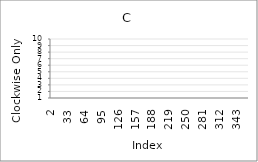
| Category | Series 0 |
|---|---|
| 2.0 | 7 |
| 3.0 | 3 |
| 4.0 | 10 |
| 5.0 | 10 |
| 6.0 | 8 |
| 7.0 | 3 |
| 8.0 | 6 |
| 9.0 | 9 |
| 10.0 | 2 |
| 11.0 | 2 |
| 12.0 | 7 |
| 13.0 | 8 |
| 14.0 | 4 |
| 15.0 | 7 |
| 16.0 | 5 |
| 17.0 | 4 |
| 18.0 | 9 |
| 19.0 | 4 |
| 20.0 | 10 |
| 21.0 | 6 |
| 22.0 | 9 |
| 23.0 | 3 |
| 24.0 | 3 |
| 25.0 | 8 |
| 26.0 | 1 |
| 27.0 | 3 |
| 28.0 | 6 |
| 29.0 | 6 |
| 30.0 | 5 |
| 31.0 | 99 |
| 32.0 | 99 |
| 33.0 | 99 |
| 34.0 | 99 |
| 35.0 | 99 |
| 36.0 | 99 |
| 37.0 | 99 |
| 38.0 | 99 |
| 39.0 | 99 |
| 40.0 | 99 |
| 41.0 | 99 |
| 42.0 | 99 |
| 43.0 | 99 |
| 44.0 | 99 |
| 45.0 | 99 |
| 46.0 | 99 |
| 47.0 | 99 |
| 48.0 | 99 |
| 49.0 | 99 |
| 50.0 | 99 |
| 51.0 | 99 |
| 52.0 | 99 |
| 53.0 | 99 |
| 54.0 | 99 |
| 55.0 | 99 |
| 56.0 | 99 |
| 57.0 | 99 |
| 58.0 | 99 |
| 59.0 | 99 |
| 60.0 | 99 |
| 61.0 | 99 |
| 62.0 | 99 |
| 63.0 | 99 |
| 64.0 | 99 |
| 65.0 | 99 |
| 66.0 | 99 |
| 67.0 | 99 |
| 68.0 | 99 |
| 69.0 | 99 |
| 70.0 | 99 |
| 71.0 | 99 |
| 72.0 | 99 |
| 73.0 | 99 |
| 74.0 | 99 |
| 75.0 | 99 |
| 76.0 | 99 |
| 77.0 | 99 |
| 78.0 | 99 |
| 79.0 | 99 |
| 80.0 | 99 |
| 81.0 | 99 |
| 82.0 | 99 |
| 83.0 | 99 |
| 84.0 | 99 |
| 85.0 | 99 |
| 86.0 | 99 |
| 87.0 | 99 |
| 88.0 | 99 |
| 89.0 | 99 |
| 90.0 | 99 |
| 91.0 | 99 |
| 92.0 | 99 |
| 93.0 | 99 |
| 94.0 | 99 |
| 95.0 | 99 |
| 96.0 | 99 |
| 97.0 | 99 |
| 98.0 | 99 |
| 99.0 | 99 |
| 100.0 | 99 |
| 101.0 | 99 |
| 102.0 | 99 |
| 103.0 | 99 |
| 104.0 | 99 |
| 105.0 | 99 |
| 106.0 | 99 |
| 107.0 | 99 |
| 108.0 | 99 |
| 109.0 | 99 |
| 110.0 | 99 |
| 111.0 | 99 |
| 112.0 | 99 |
| 113.0 | 99 |
| 114.0 | 99 |
| 115.0 | 99 |
| 116.0 | 99 |
| 117.0 | 99 |
| 118.0 | 99 |
| 119.0 | 99 |
| 120.0 | 99 |
| 121.0 | 99 |
| 122.0 | 99 |
| 123.0 | 99 |
| 124.0 | 99 |
| 125.0 | 99 |
| 126.0 | 99 |
| 127.0 | 99 |
| 128.0 | 99 |
| 129.0 | 99 |
| 130.0 | 99 |
| 131.0 | 99 |
| 132.0 | 99 |
| 133.0 | 99 |
| 134.0 | 99 |
| 135.0 | 99 |
| 136.0 | 99 |
| 137.0 | 99 |
| 138.0 | 99 |
| 139.0 | 99 |
| 140.0 | 99 |
| 141.0 | 99 |
| 142.0 | 99 |
| 143.0 | 99 |
| 144.0 | 99 |
| 145.0 | 99 |
| 146.0 | 99 |
| 147.0 | 99 |
| 148.0 | 99 |
| 149.0 | 99 |
| 150.0 | 99 |
| 151.0 | 99 |
| 152.0 | 99 |
| 153.0 | 99 |
| 154.0 | 99 |
| 155.0 | 99 |
| 156.0 | 99 |
| 157.0 | 99 |
| 158.0 | 99 |
| 159.0 | 99 |
| 160.0 | 99 |
| 161.0 | 99 |
| 162.0 | 99 |
| 163.0 | 99 |
| 164.0 | 99 |
| 165.0 | 99 |
| 166.0 | 99 |
| 167.0 | 99 |
| 168.0 | 99 |
| 169.0 | 99 |
| 170.0 | 99 |
| 171.0 | 99 |
| 172.0 | 99 |
| 173.0 | 99 |
| 174.0 | 99 |
| 175.0 | 99 |
| 176.0 | 99 |
| 177.0 | 99 |
| 178.0 | 99 |
| 179.0 | 99 |
| 180.0 | 99 |
| 181.0 | 99 |
| 182.0 | 99 |
| 183.0 | 99 |
| 184.0 | 99 |
| 185.0 | 99 |
| 186.0 | 99 |
| 187.0 | 99 |
| 188.0 | 99 |
| 189.0 | 99 |
| 190.0 | 99 |
| 191.0 | 99 |
| 192.0 | 99 |
| 193.0 | 99 |
| 194.0 | 99 |
| 195.0 | 99 |
| 196.0 | 99 |
| 197.0 | 99 |
| 198.0 | 99 |
| 199.0 | 99 |
| 200.0 | 99 |
| 201.0 | 99 |
| 202.0 | 99 |
| 203.0 | 99 |
| 204.0 | 99 |
| 205.0 | 99 |
| 206.0 | 99 |
| 207.0 | 99 |
| 208.0 | 99 |
| 209.0 | 99 |
| 210.0 | 99 |
| 211.0 | 99 |
| 212.0 | 99 |
| 213.0 | 99 |
| 214.0 | 99 |
| 215.0 | 99 |
| 216.0 | 99 |
| 217.0 | 99 |
| 218.0 | 99 |
| 219.0 | 99 |
| 220.0 | 99 |
| 221.0 | 99 |
| 222.0 | 99 |
| 223.0 | 99 |
| 224.0 | 99 |
| 225.0 | 99 |
| 226.0 | 99 |
| 227.0 | 99 |
| 228.0 | 99 |
| 229.0 | 99 |
| 230.0 | 99 |
| 231.0 | 99 |
| 232.0 | 99 |
| 233.0 | 99 |
| 234.0 | 99 |
| 235.0 | 99 |
| 236.0 | 99 |
| 237.0 | 99 |
| 238.0 | 99 |
| 239.0 | 99 |
| 240.0 | 99 |
| 241.0 | 99 |
| 242.0 | 99 |
| 243.0 | 99 |
| 244.0 | 99 |
| 245.0 | 99 |
| 246.0 | 99 |
| 247.0 | 99 |
| 248.0 | 99 |
| 249.0 | 99 |
| 250.0 | 99 |
| 251.0 | 99 |
| 252.0 | 99 |
| 253.0 | 99 |
| 254.0 | 99 |
| 255.0 | 99 |
| 256.0 | 99 |
| 257.0 | 99 |
| 258.0 | 99 |
| 259.0 | 99 |
| 260.0 | 99 |
| 261.0 | 99 |
| 262.0 | 99 |
| 263.0 | 99 |
| 264.0 | 99 |
| 265.0 | 99 |
| 266.0 | 99 |
| 267.0 | 99 |
| 268.0 | 99 |
| 269.0 | 99 |
| 270.0 | 99 |
| 271.0 | 99 |
| 272.0 | 99 |
| 273.0 | 99 |
| 274.0 | 99 |
| 275.0 | 99 |
| 276.0 | 99 |
| 277.0 | 99 |
| 278.0 | 99 |
| 279.0 | 99 |
| 280.0 | 99 |
| 281.0 | 99 |
| 282.0 | 99 |
| 283.0 | 99 |
| 284.0 | 99 |
| 285.0 | 99 |
| 286.0 | 99 |
| 287.0 | 99 |
| 288.0 | 99 |
| 289.0 | 99 |
| 290.0 | 99 |
| 291.0 | 99 |
| 292.0 | 99 |
| 293.0 | 99 |
| 294.0 | 99 |
| 295.0 | 99 |
| 296.0 | 99 |
| 297.0 | 99 |
| 298.0 | 99 |
| 299.0 | 99 |
| 300.0 | 99 |
| 301.0 | 99 |
| 302.0 | 99 |
| 303.0 | 99 |
| 304.0 | 99 |
| 305.0 | 99 |
| 306.0 | 99 |
| 307.0 | 99 |
| 308.0 | 99 |
| 309.0 | 99 |
| 310.0 | 99 |
| 311.0 | 99 |
| 312.0 | 99 |
| 313.0 | 99 |
| 314.0 | 99 |
| 315.0 | 99 |
| 316.0 | 99 |
| 317.0 | 99 |
| 318.0 | 99 |
| 319.0 | 99 |
| 320.0 | 99 |
| 321.0 | 99 |
| 322.0 | 99 |
| 323.0 | 99 |
| 324.0 | 99 |
| 325.0 | 99 |
| 326.0 | 99 |
| 327.0 | 99 |
| 328.0 | 99 |
| 329.0 | 99 |
| 330.0 | 99 |
| 331.0 | 99 |
| 332.0 | 99 |
| 333.0 | 99 |
| 334.0 | 99 |
| 335.0 | 99 |
| 336.0 | 99 |
| 337.0 | 99 |
| 338.0 | 99 |
| 339.0 | 99 |
| 340.0 | 99 |
| 341.0 | 99 |
| 342.0 | 99 |
| 343.0 | 99 |
| 344.0 | 99 |
| 345.0 | 99 |
| 346.0 | 99 |
| 347.0 | 99 |
| 348.0 | 99 |
| 349.0 | 99 |
| 350.0 | 99 |
| 351.0 | 99 |
| 352.0 | 99 |
| 353.0 | 99 |
| 354.0 | 99 |
| 355.0 | 99 |
| 356.0 | 99 |
| 357.0 | 99 |
| 358.0 | 99 |
| 359.0 | 99 |
| 360.0 | 99 |
| 361.0 | 99 |
| 362.0 | 99 |
| 363.0 | 99 |
| 364.0 | 99 |
| 365.0 | 99 |